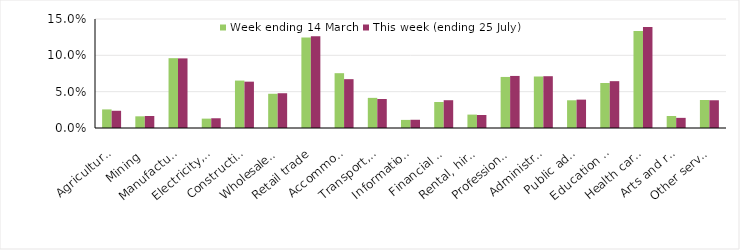
| Category | Week ending 14 March | This week (ending 25 July) |
|---|---|---|
| Agriculture, forestry and fishing | 0.026 | 0.024 |
| Mining | 0.016 | 0.017 |
| Manufacturing | 0.096 | 0.096 |
| Electricity, gas, water and waste services | 0.013 | 0.013 |
| Construction | 0.065 | 0.064 |
| Wholesale trade | 0.047 | 0.048 |
| Retail trade | 0.124 | 0.126 |
| Accommodation and food services | 0.075 | 0.067 |
| Transport, postal and warehousing | 0.041 | 0.04 |
| Information media and telecommunications | 0.011 | 0.011 |
| Financial and insurance services | 0.036 | 0.038 |
| Rental, hiring and real estate services | 0.018 | 0.018 |
| Professional, scientific and technical services | 0.07 | 0.072 |
| Administrative and support services | 0.071 | 0.071 |
| Public administration and safety | 0.038 | 0.039 |
| Education and training | 0.062 | 0.064 |
| Health care and social assistance | 0.133 | 0.139 |
| Arts and recreation services | 0.016 | 0.014 |
| Other services | 0.039 | 0.038 |